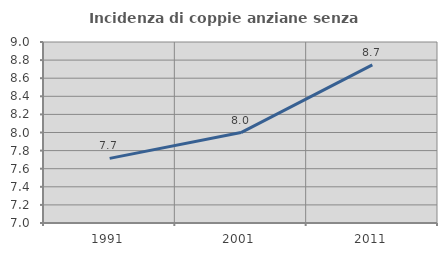
| Category | Incidenza di coppie anziane senza figli  |
|---|---|
| 1991.0 | 7.714 |
| 2001.0 | 7.999 |
| 2011.0 | 8.747 |